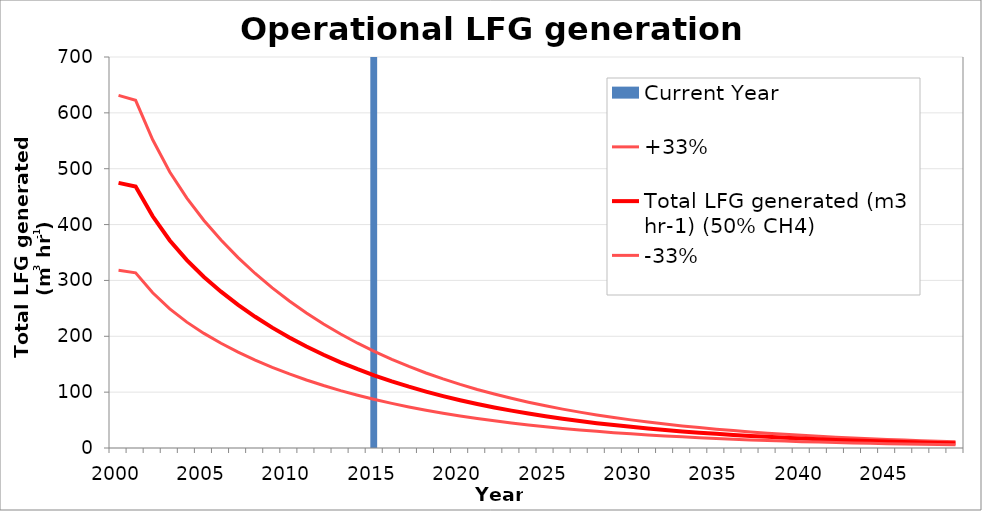
| Category | Current Year |
|---|---|
| 2000.0 | 0 |
| 2001.0 | 0 |
| 2002.0 | 0 |
| 2003.0 | 0 |
| 2004.0 | 0 |
| 2005.0 | 0 |
| 2006.0 | 0 |
| 2007.0 | 0 |
| 2008.0 | 0 |
| 2009.0 | 0 |
| 2010.0 | 0 |
| 2011.0 | 0 |
| 2012.0 | 0 |
| 2013.0 | 0 |
| 2014.0 | 0 |
| 2015.0 | 1 |
| 2016.0 | 0 |
| 2017.0 | 0 |
| 2018.0 | 0 |
| 2019.0 | 0 |
| 2020.0 | 0 |
| 2021.0 | 0 |
| 2022.0 | 0 |
| 2023.0 | 0 |
| 2024.0 | 0 |
| 2025.0 | 0 |
| 2026.0 | 0 |
| 2027.0 | 0 |
| 2028.0 | 0 |
| 2029.0 | 0 |
| 2030.0 | 0 |
| 2031.0 | 0 |
| 2032.0 | 0 |
| 2033.0 | 0 |
| 2034.0 | 0 |
| 2035.0 | 0 |
| 2036.0 | 0 |
| 2037.0 | 0 |
| 2038.0 | 0 |
| 2039.0 | 0 |
| 2040.0 | 0 |
| 2041.0 | 0 |
| 2042.0 | 0 |
| 2043.0 | 0 |
| 2044.0 | 0 |
| 2045.0 | 0 |
| 2046.0 | 0 |
| 2047.0 | 0 |
| 2048.0 | 0 |
| 2049.0 | 0 |